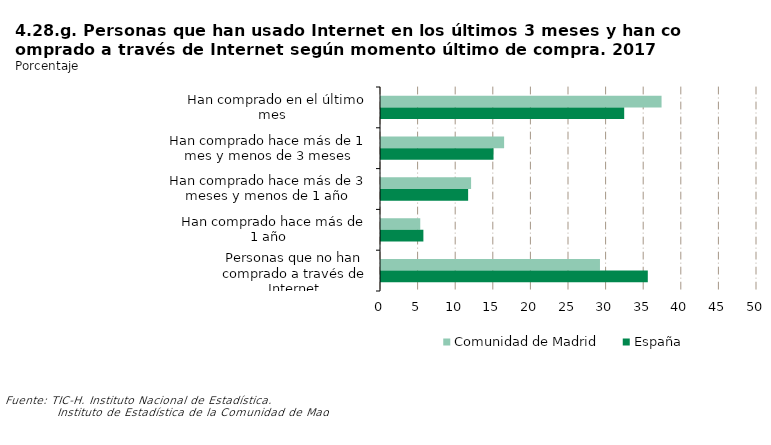
| Category | Comunidad de Madrid | España |
|---|---|---|
|    Han comprado en el último mes | 37.308 | 32.34 |
| Han comprado hace más de 1 mes y menos de 3 meses | 16.372 | 14.959 |
| Han comprado hace más de 3 meses y menos de 1 año | 11.98 | 11.586 |
|    Han comprado hace más de 1 año | 5.221 | 5.636 |
| Personas que no han comprado a través de Internet | 29.119 | 35.478 |